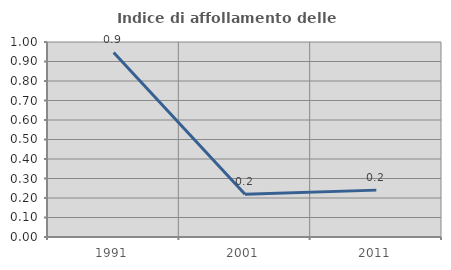
| Category | Indice di affollamento delle abitazioni  |
|---|---|
| 1991.0 | 0.947 |
| 2001.0 | 0.219 |
| 2011.0 | 0.24 |